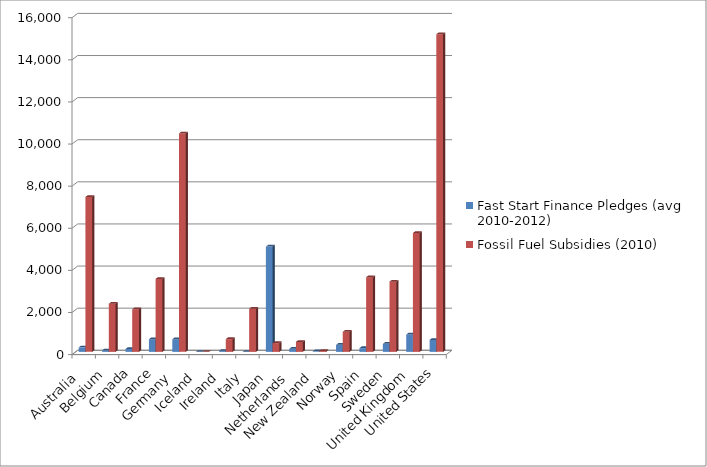
| Category | Fast Start Finance Pledges (avg 2010-2012) | Fossil Fuel Subsidies (2010) |
|---|---|---|
| Australia  | 213.667 | 7356.31 |
| Belgium | 71.333 | 2286.425 |
| Canada | 136.333 | 2025.819 |
| France | 600 | 3463.564 |
| Germany  | 600 | 10376.074 |
| Iceland  | 0.333 | 0 |
| Ireland  | 47.667 | 606.515 |
| Italy  | 0 | 2051.601 |
| Japan  | 5000 | 416.088 |
| Netherlands  | 147.667 | 471.665 |
| New Zealand  | 24.667 | 40.824 |
| Norway  | 333.333 | 953.074 |
| Spain | 178.667 | 3547.183 |
| Sweden | 381 | 3335.47 |
| United Kingdom | 823.667 | 5646.42 |
| United States | 568 | 15087.32 |